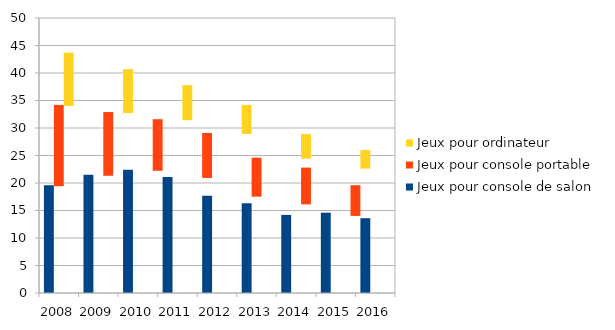
| Category | Jeux pour console de salon | Jeux pour console portable | Jeux pour ordinateur |
|---|---|---|---|
| 2008.0 | 19.6 | 14.6 | 9.5 |
| 2009.0 | 21.5 | 11.4 | 7.8 |
| 2010.0 | 22.4 | 9.2 | 6.2 |
| 2011.0 | 21.1 | 8 | 5.1 |
| 2012.0 | 17.7 | 6.9 | 4.3 |
| 2013.0 | 16.3 | 6.5 | 3.2 |
| 2014.0 | 14.2 | 5.4 | 2.5 |
| 2015.0 | 14.6 | 4.1 | 2 |
| 2016.0 | 13.6 | 4.3 | 1.4 |